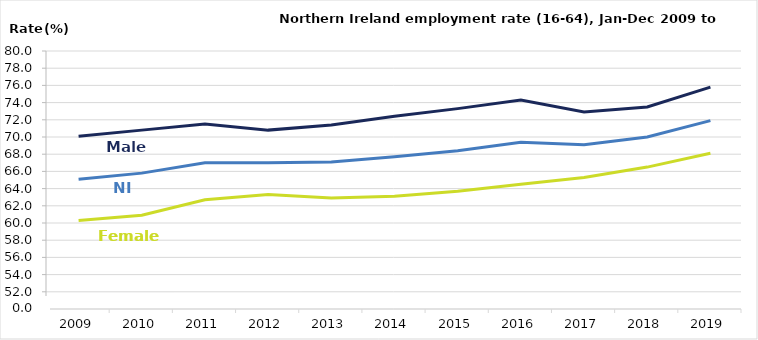
| Category | Male | Female | Total |
|---|---|---|---|
| 2009.0 | 70.1 | 60.3 | 65.1 |
| 2010.0 | 70.8 | 60.9 | 65.8 |
| 2011.0 | 71.5 | 62.7 | 67 |
| 2012.0 | 70.8 | 63.3 | 67 |
| 2013.0 | 71.4 | 62.9 | 67.1 |
| 2014.0 | 72.4 | 63.1 | 67.7 |
| 2015.0 | 73.3 | 63.7 | 68.4 |
| 2016.0 | 74.3 | 64.5 | 69.4 |
| 2017.0 | 72.9 | 65.3 | 69.1 |
| 2018.0 | 73.5 | 66.5 | 70 |
| 2019.0 | 75.8 | 68.1 | 71.9 |